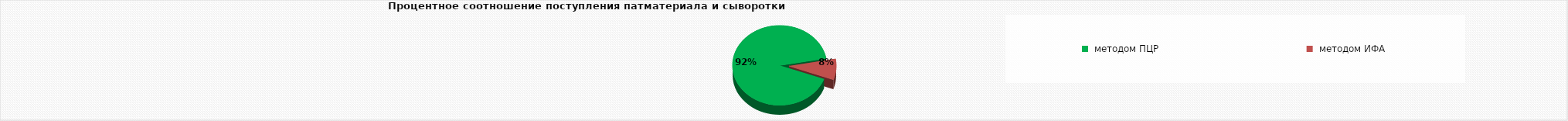
| Category | сыворотка | 1860 |
|---|---|---|
|  методом ПЦР | 1860 |  |
|  методом ИФА | 171 |  |